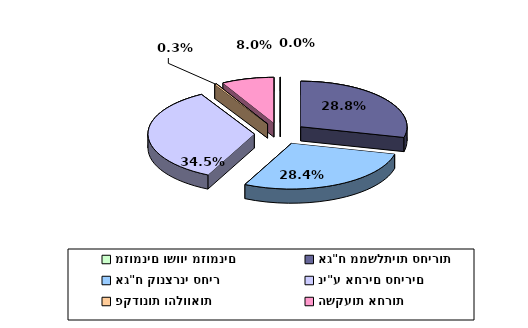
| Category | Series 0 |
|---|---|
| מזומנים ושווי מזומנים | 0 |
| אג"ח ממשלתיות סחירות | 0.288 |
| אג"ח קונצרני סחיר | 0.284 |
| ני"ע אחרים סחירים | 0.345 |
| פקדונות והלוואות | 0.003 |
| השקעות אחרות | 0.08 |